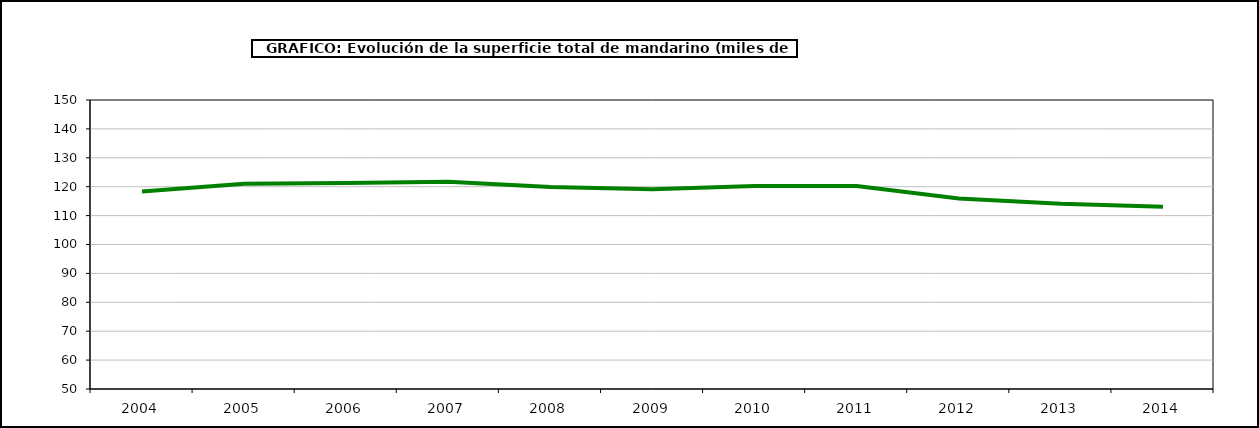
| Category | superficie |
|---|---|
| 2004.0 | 118.356 |
| 2005.0 | 121.044 |
| 2006.0 | 121.292 |
| 2007.0 | 121.727 |
| 2008.0 | 119.875 |
| 2009.0 | 119.154 |
| 2010.0 | 120.256 |
| 2011.0 | 120.212 |
| 2012.0 | 115.927 |
| 2013.0 | 114.076 |
| 2014.0 | 113.102 |